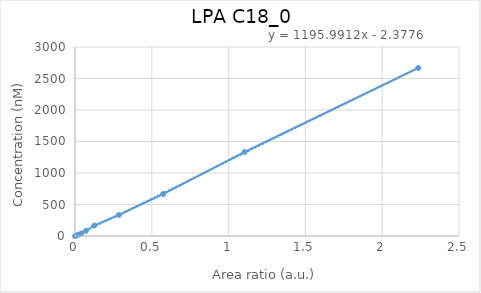
| Category | LPA C18_0 |
|---|---|
| 0.0 | 0 |
| 0.0101283 | 10.417 |
| 0.0234296 | 20.833 |
| 0.0416097 | 41.667 |
| 0.071892 | 83.333 |
| 0.125757 | 166.667 |
| 0.285332 | 333.333 |
| 0.573943 | 666.667 |
| 1.10402 | 1333.333 |
| 2.2344 | 2666.667 |